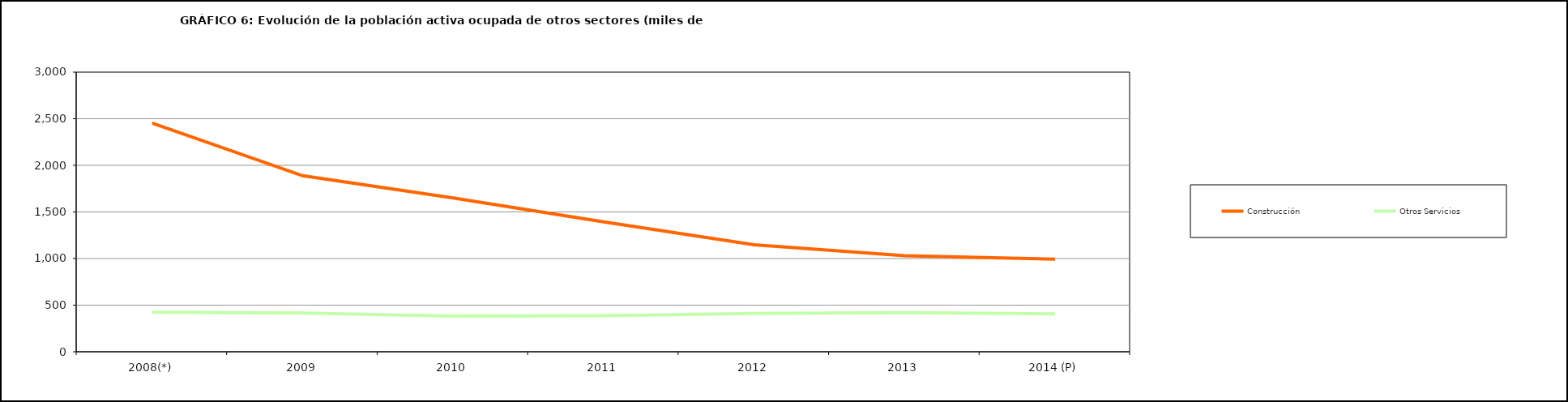
| Category | Construcción | Otros Servicios |
|---|---|---|
| 2008(*) | 2453.425 | 423.075 |
| 2009 | 1888.275 | 416.175 |
| 2010 | 1650.825 | 382 |
| 2011 | 1392.95 | 387.25 |
| 2012 | 1147.575 | 410.85 |
| 2013 | 1029.6 | 419.6 |
| 2014 (P) | 993.5 | 405.475 |